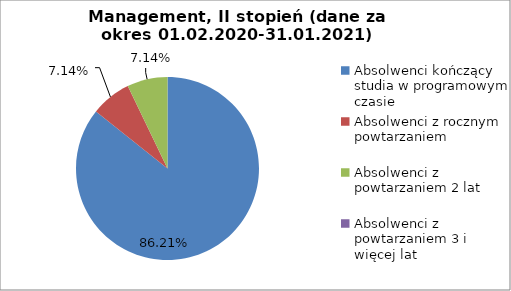
| Category | Series 0 |
|---|---|
| Absolwenci kończący studia w programowym czasie | 85.714 |
| Absolwenci z rocznym powtarzaniem | 7.143 |
| Absolwenci z powtarzaniem 2 lat | 7.143 |
| Absolwenci z powtarzaniem 3 i więcej lat | 0 |